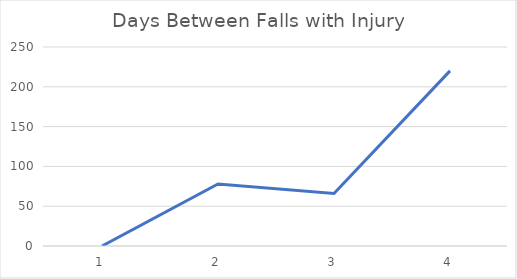
| Category | Series 0 |
|---|---|
| 0 | 0 |
| 1 | 78 |
| 2 | 66 |
| 3 | 220 |